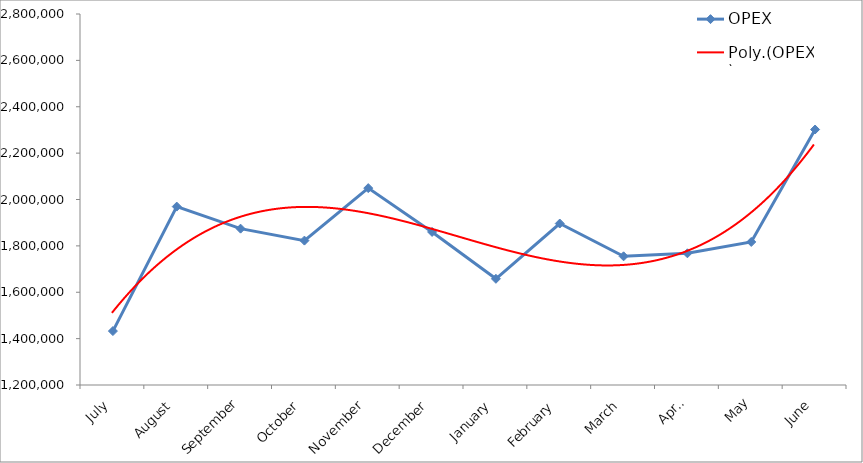
| Category | OPEX |
|---|---|
| July | 1432563 |
| August | 1969462 |
| September | 1874256 |
| October | 1822734 |
| November | 2049097 |
| December | 1860129 |
| January | 1658002 |
| February | 1896385 |
| March | 1754925 |
| April | 1767961 |
| May | 1816876 |
| June | 2301784 |